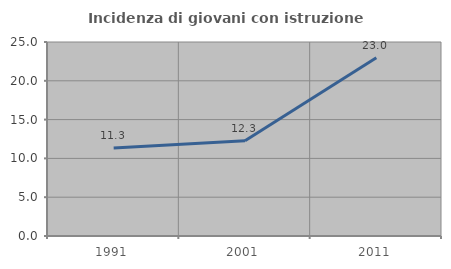
| Category | Incidenza di giovani con istruzione universitaria |
|---|---|
| 1991.0 | 11.348 |
| 2001.0 | 12.27 |
| 2011.0 | 22.959 |